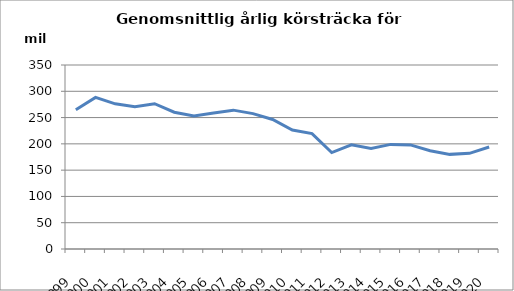
| Category | Series 0 |
|---|---|
| 1999.0 | 264.709 |
| 2000.0 | 288.43 |
| 2001.0 | 276.111 |
| 2002.0 | 270.644 |
| 2003.0 | 276.316 |
| 2004.0 | 260.212 |
| 2005.0 | 253.081 |
| 2006.0 | 258.824 |
| 2007.0 | 264.121 |
| 2008.0 | 257.478 |
| 2009.0 | 246.424 |
| 2010.0 | 226.301 |
| 2011.0 | 219.472 |
| 2012.0 | 183.491 |
| 2013.0 | 198.089 |
| 2014.0 | 191 |
| 2015.0 | 199 |
| 2016.0 | 198 |
| 2017.0 | 187 |
| 2018.0 | 180 |
| 2019.0 | 182 |
| 2020.0 | 194 |